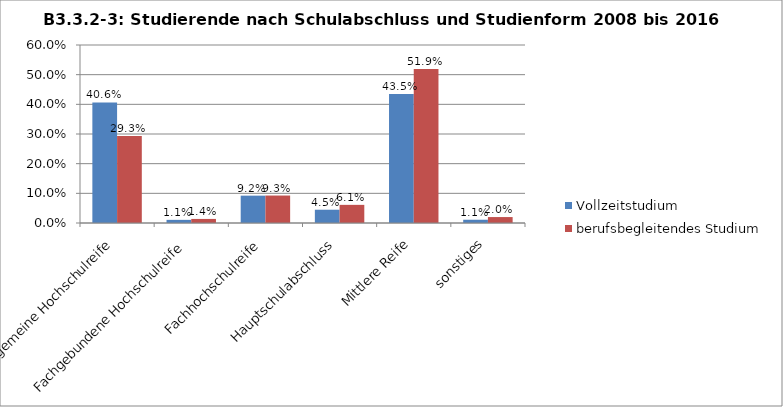
| Category | Vollzeitstudium | berufsbegleitendes Studium |
|---|---|---|
| Allgemeine Hochschulreife | 0.406 | 0.293 |
| Fachgebundene Hochschulreife | 0.011 | 0.014 |
| Fachhochschulreife | 0.092 | 0.093 |
| Hauptschulabschluss | 0.045 | 0.061 |
| Mittlere Reife | 0.435 | 0.519 |
| sonstiges | 0.011 | 0.02 |